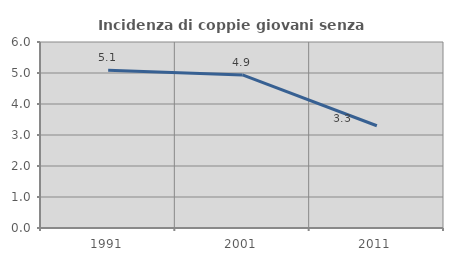
| Category | Incidenza di coppie giovani senza figli |
|---|---|
| 1991.0 | 5.091 |
| 2001.0 | 4.937 |
| 2011.0 | 3.299 |